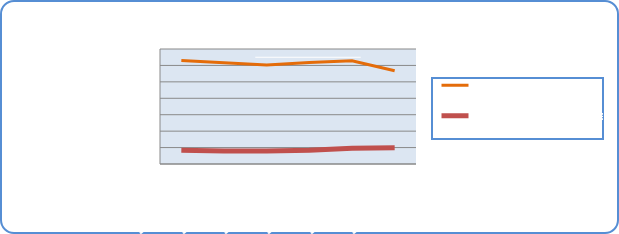
| Category | Motorin Türleri | Benzin Türleri |
|---|---|---|
| 9/23/19 | 63021270.854 | 8368102.706 |
| 9/24/19 | 61663421.903 | 7911263.682 |
| 9/25/19 | 60333398.655 | 7866489.693 |
| 9/26/19 | 61787229.962 | 8321716.048 |
| 9/27/19 | 62827684.962 | 9577797.76 |
| 9/28/19 | 56752814.844 | 9847120.327 |